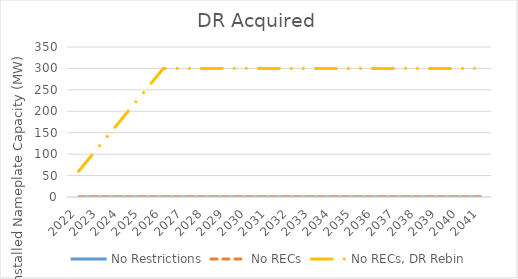
| Category | No Restrictions | No RECs | No RECs, DR Rebin |
|---|---|---|---|
| 2022.0 | 0 | 0 | 60 |
| 2023.0 | 0 | 0 | 120 |
| 2024.0 | 0 | 0 | 180 |
| 2025.0 | 0 | 0 | 240 |
| 2026.0 | 0 | 0 | 300 |
| 2027.0 | 0 | 0 | 300 |
| 2028.0 | 0 | 0 | 300 |
| 2029.0 | 0 | 0 | 300 |
| 2030.0 | 0 | 0 | 300 |
| 2031.0 | 0 | 0 | 300 |
| 2032.0 | 0 | 0 | 300 |
| 2033.0 | 0 | 0 | 300 |
| 2034.0 | 0 | 0 | 300 |
| 2035.0 | 0 | 0 | 300 |
| 2036.0 | 0 | 0 | 300 |
| 2037.0 | 0 | 0 | 300 |
| 2038.0 | 0 | 0 | 300 |
| 2039.0 | 0 | 0 | 300 |
| 2040.0 | 0 | 0 | 300 |
| 2041.0 | 0 | 0 | 300 |